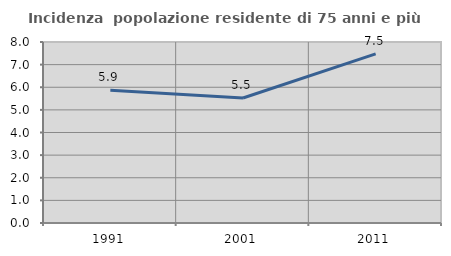
| Category | Incidenza  popolazione residente di 75 anni e più |
|---|---|
| 1991.0 | 5.863 |
| 2001.0 | 5.525 |
| 2011.0 | 7.475 |